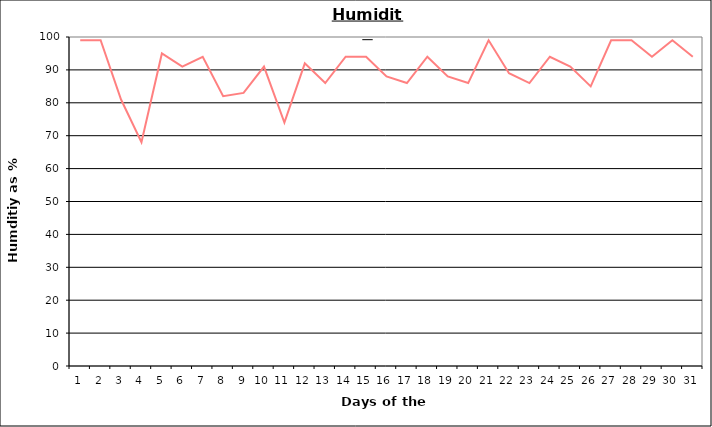
| Category | Series 0 |
|---|---|
| 0 | 99 |
| 1 | 99 |
| 2 | 81 |
| 3 | 68 |
| 4 | 95 |
| 5 | 91 |
| 6 | 94 |
| 7 | 82 |
| 8 | 83 |
| 9 | 91 |
| 10 | 74 |
| 11 | 92 |
| 12 | 86 |
| 13 | 94 |
| 14 | 94 |
| 15 | 88 |
| 16 | 86 |
| 17 | 94 |
| 18 | 88 |
| 19 | 86 |
| 20 | 99 |
| 21 | 89 |
| 22 | 86 |
| 23 | 94 |
| 24 | 91 |
| 25 | 85 |
| 26 | 99 |
| 27 | 99 |
| 28 | 94 |
| 29 | 99 |
| 30 | 94 |